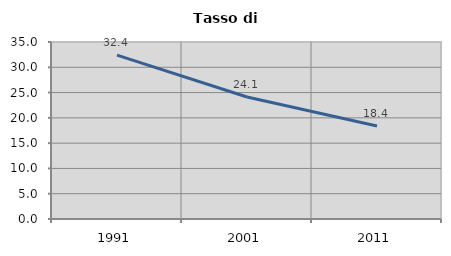
| Category | Tasso di disoccupazione   |
|---|---|
| 1991.0 | 32.41 |
| 2001.0 | 24.129 |
| 2011.0 | 18.391 |